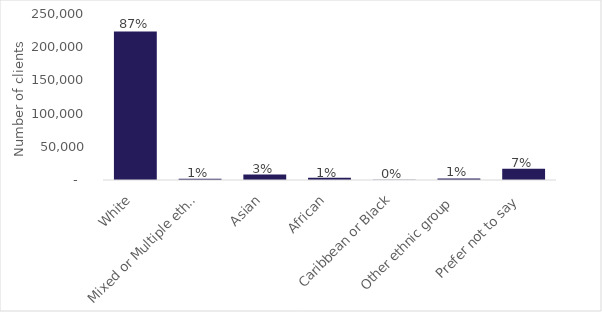
| Category | Series 0 |
|---|---|
| White | 223585 |
| Mixed or Multiple ethnic groups | 2035 |
| Asian | 8295 |
| African | 3240 |
| Caribbean or Black | 370 |
| Other ethnic group | 2180 |
| Prefer not to say | 16915 |